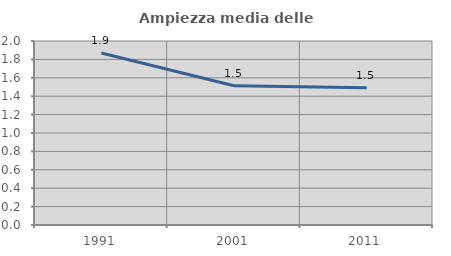
| Category | Ampiezza media delle famiglie |
|---|---|
| 1991.0 | 1.87 |
| 2001.0 | 1.514 |
| 2011.0 | 1.493 |